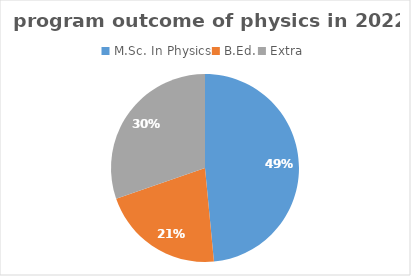
| Category | Series 0 |
|---|---|
| M.Sc. In Physics | 16 |
| B.Ed. | 7 |
| Extra | 10 |